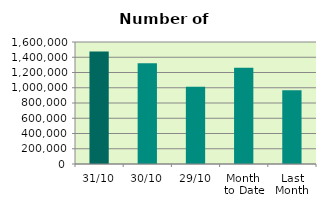
| Category | Series 0 |
|---|---|
| 31/10 | 1475446 |
| 30/10 | 1322812 |
| 29/10 | 1012138 |
| Month 
to Date | 1260789.391 |
| Last
Month | 967047.5 |